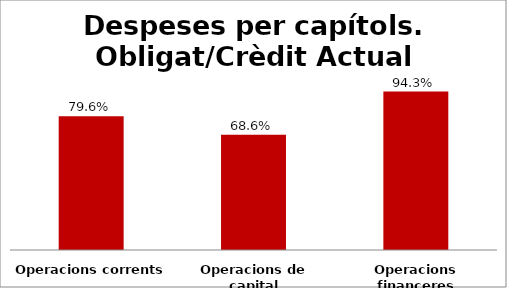
| Category | Series 0 |
|---|---|
| Operacions corrents | 0.796 |
| Operacions de capital | 0.686 |
| Operacions financeres | 0.943 |